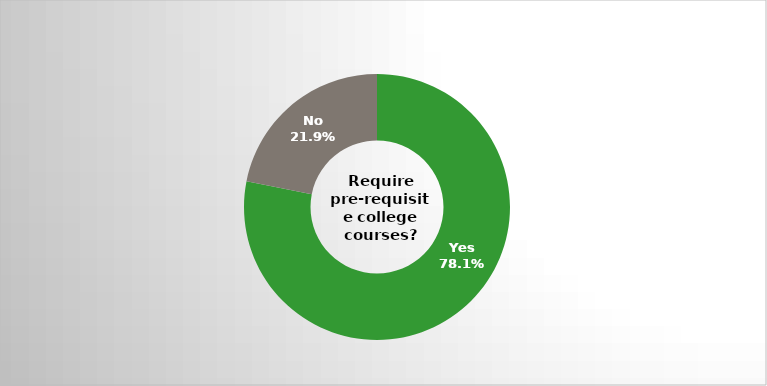
| Category | Series 0 |
|---|---|
| Yes | 0.781 |
| No | 0.219 |